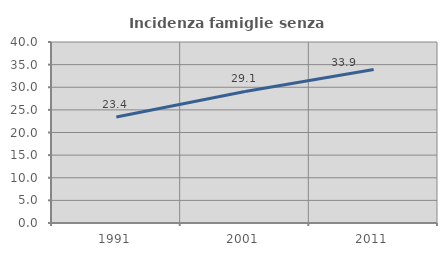
| Category | Incidenza famiglie senza nuclei |
|---|---|
| 1991.0 | 23.407 |
| 2001.0 | 29.068 |
| 2011.0 | 33.943 |